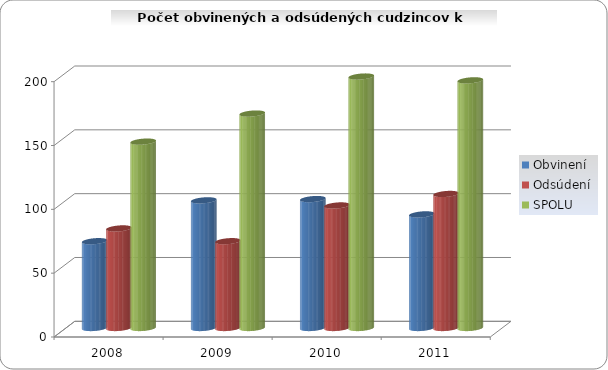
| Category | Obvinení | Odsúdení | SPOLU |
|---|---|---|---|
| 2008.0 | 68 | 78 | 146 |
| 2009.0 | 100 | 68 | 168 |
| 2010.0 | 101 | 96 | 197 |
| 2011.0 | 89 | 105 | 194 |